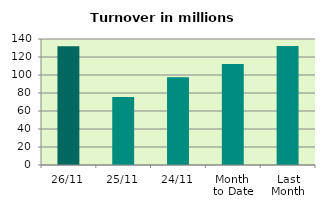
| Category | Series 0 |
|---|---|
| 26/11 | 132.033 |
| 25/11 | 75.673 |
| 24/11 | 97.638 |
| Month 
to Date | 112.129 |
| Last
Month | 132.268 |